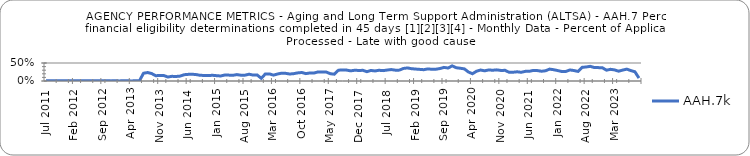
| Category | AAH.7k |
|---|---|
| 2011-07-01 | 0.005 |
| 2011-08-01 | 0.004 |
| 2011-09-01 | 0.004 |
| 2011-10-01 | 0.006 |
| 2011-11-01 | 0.006 |
| 2011-12-01 | 0.01 |
| 2012-01-01 | 0.006 |
| 2012-02-01 | 0.004 |
| 2012-03-01 | 0.005 |
| 2012-04-01 | 0.004 |
| 2012-05-01 | 0.006 |
| 2012-06-01 | 0.004 |
| 2012-07-01 | 0.005 |
| 2012-08-01 | 0.005 |
| 2012-09-01 | 0.003 |
| 2012-10-01 | 0.005 |
| 2012-11-01 | 0.003 |
| 2012-12-01 | 0.006 |
| 2013-01-01 | 0.003 |
| 2013-02-01 | 0.005 |
| 2013-03-01 | 0.007 |
| 2013-04-01 | 0.002 |
| 2013-05-01 | 0.005 |
| 2013-06-01 | 0.005 |
| 2013-07-01 | 0.215 |
| 2013-08-01 | 0.235 |
| 2013-09-01 | 0.207 |
| 2013-10-01 | 0.147 |
| 2013-11-01 | 0.152 |
| 2013-12-01 | 0.152 |
| 2014-01-01 | 0.111 |
| 2014-02-01 | 0.129 |
| 2014-03-01 | 0.125 |
| 2014-04-01 | 0.136 |
| 2014-05-01 | 0.175 |
| 2014-06-01 | 0.184 |
| 2014-07-01 | 0.188 |
| 2014-08-01 | 0.177 |
| 2014-09-01 | 0.158 |
| 2014-10-01 | 0.155 |
| 2014-11-01 | 0.152 |
| 2014-12-01 | 0.159 |
| 2015-01-01 | 0.148 |
| 2015-02-01 | 0.139 |
| 2015-03-01 | 0.166 |
| 2015-04-01 | 0.163 |
| 2015-05-01 | 0.158 |
| 2015-06-01 | 0.178 |
| 2015-07-01 | 0.16 |
| 2015-08-01 | 0.163 |
| 2015-09-01 | 0.188 |
| 2015-10-01 | 0.164 |
| 2015-11-01 | 0.166 |
| 2015-12-01 | 0.075 |
| 2016-01-01 | 0.195 |
| 2016-02-01 | 0.198 |
| 2016-03-01 | 0.163 |
| 2016-04-01 | 0.194 |
| 2016-05-01 | 0.217 |
| 2016-06-01 | 0.213 |
| 2016-07-01 | 0.194 |
| 2016-08-01 | 0.204 |
| 2016-09-01 | 0.226 |
| 2016-10-01 | 0.236 |
| 2016-11-01 | 0.205 |
| 2016-12-01 | 0.225 |
| 2017-01-01 | 0.222 |
| 2017-02-01 | 0.253 |
| 2017-03-01 | 0.251 |
| 2017-04-01 | 0.248 |
| 2017-05-01 | 0.202 |
| 2017-06-01 | 0.189 |
| 2017-07-01 | 0.3 |
| 2017-08-01 | 0.306 |
| 2017-09-01 | 0.303 |
| 2017-10-01 | 0.282 |
| 2017-11-01 | 0.298 |
| 2017-12-01 | 0.293 |
| 2018-01-01 | 0.296 |
| 2018-02-01 | 0.259 |
| 2018-03-01 | 0.293 |
| 2018-04-01 | 0.279 |
| 2018-05-01 | 0.298 |
| 2018-06-01 | 0.288 |
| 2018-07-01 | 0.305 |
| 2018-08-01 | 0.318 |
| 2018-09-01 | 0.301 |
| 2018-10-01 | 0.302 |
| 2018-11-01 | 0.348 |
| 2018-12-01 | 0.363 |
| 2019-01-01 | 0.342 |
| 2019-02-01 | 0.332 |
| 2019-03-01 | 0.323 |
| 2019-04-01 | 0.314 |
| 2019-05-01 | 0.337 |
| 2019-06-01 | 0.325 |
| 2019-07-01 | 0.327 |
| 2019-08-01 | 0.346 |
| 2019-09-01 | 0.378 |
| 2019-10-01 | 0.36 |
| 2019-11-01 | 0.42 |
| 2019-12-01 | 0.369 |
| 2020-01-01 | 0.354 |
| 2020-02-01 | 0.337 |
| 2020-03-01 | 0.25 |
| 2020-04-01 | 0.202 |
| 2020-05-01 | 0.271 |
| 2020-06-01 | 0.305 |
| 2020-07-01 | 0.283 |
| 2020-08-01 | 0.306 |
| 2020-09-01 | 0.299 |
| 2020-10-01 | 0.309 |
| 2020-11-01 | 0.292 |
| 2020-12-01 | 0.296 |
| 2021-01-01 | 0.244 |
| 2021-02-01 | 0.244 |
| 2021-03-01 | 0.256 |
| 2021-04-01 | 0.242 |
| 2021-05-01 | 0.267 |
| 2021-06-01 | 0.27 |
| 2021-07-01 | 0.294 |
| 2021-08-01 | 0.289 |
| 2021-09-01 | 0.271 |
| 2021-10-01 | 0.285 |
| 2021-11-01 | 0.331 |
| 2021-12-01 | 0.314 |
| 2022-01-01 | 0.289 |
| 2022-02-01 | 0.264 |
| 2022-03-01 | 0.265 |
| 2022-04-01 | 0.307 |
| 2022-05-01 | 0.29 |
| 2022-06-01 | 0.266 |
| 2022-07-01 | 0.379 |
| 2022-08-01 | 0.39 |
| 2022-09-01 | 0.407 |
| 2022-10-01 | 0.374 |
| 2022-11-01 | 0.372 |
| 2022-12-01 | 0.367 |
| 2023-01-01 | 0.301 |
| 2023-02-01 | 0.325 |
| 2023-03-01 | 0.308 |
| 2023-04-01 | 0.272 |
| 2023-05-01 | 0.303 |
| 2023-06-01 | 0.33 |
| 2023-07-01 | 0.29 |
| 2023-08-01 | 0.256 |
| 2023-09-01 | 0.081 |